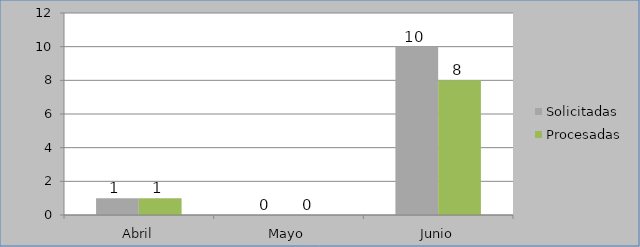
| Category | Solicitadas | Procesadas |
|---|---|---|
| Abril | 1 | 1 |
| Mayo | 0 | 0 |
| Junio | 10 | 8 |